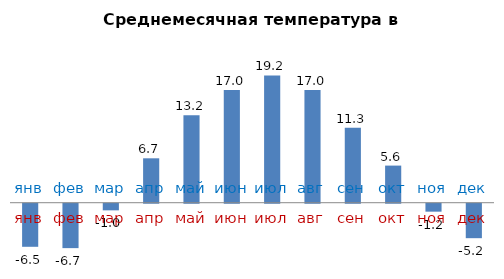
| Category | Среднемесячная температура в Москве |
|---|---|
| янв | -6.5 |
| фев | -6.7 |
| мар | -1 |
| апр | 6.7 |
| май | 13.2 |
| июн | 17 |
| июл | 19.2 |
| авг | 17 |
| сен | 11.3 |
| окт | 5.6 |
| ноя | -1.2 |
| дек | -5.2 |